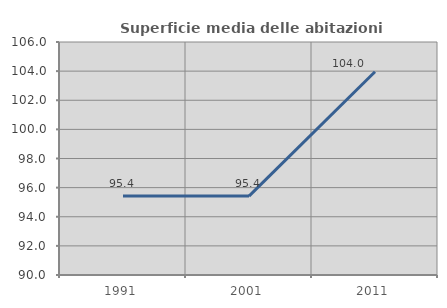
| Category | Superficie media delle abitazioni occupate |
|---|---|
| 1991.0 | 95.427 |
| 2001.0 | 95.419 |
| 2011.0 | 103.954 |